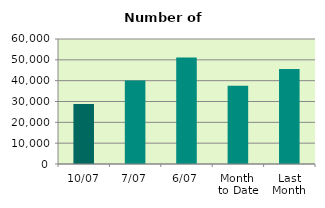
| Category | Series 0 |
|---|---|
| 10/07 | 28852 |
| 7/07 | 40062 |
| 6/07 | 51168 |
| Month 
to Date | 37526 |
| Last
Month | 45645.364 |